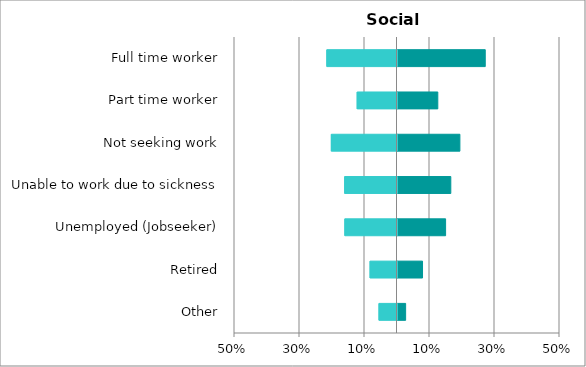
| Category | PRP | LA |
|---|---|---|
| Other | 0.025 | -0.055 |
| Retired | 0.077 | -0.083 |
| Unemployed (Jobseeker) | 0.148 | -0.16 |
| Unable to work due to sickness | 0.164 | -0.161 |
| Not seeking work | 0.192 | -0.202 |
| Part time worker | 0.124 | -0.123 |
| Full time worker | 0.27 | -0.216 |